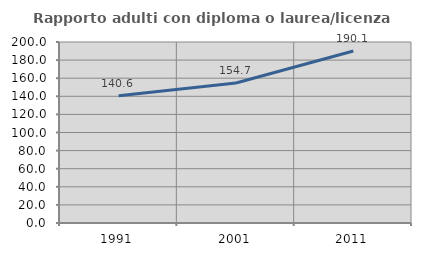
| Category | Rapporto adulti con diploma o laurea/licenza media  |
|---|---|
| 1991.0 | 140.617 |
| 2001.0 | 154.715 |
| 2011.0 | 190.08 |